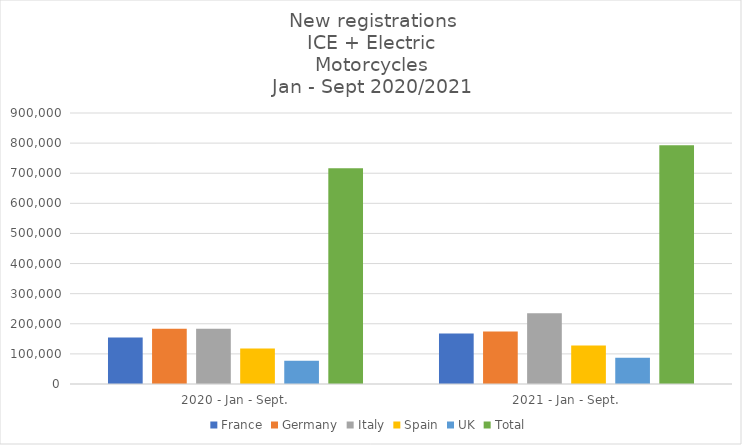
| Category | France | Germany | Italy | Spain | UK | Total |
|---|---|---|---|---|---|---|
| 2020 - Jan - Sept. | 154823 | 183628 | 183777 | 117644 | 76830 | 716702 |
| 2021 - Jan - Sept. | 168008 | 174623 | 235132 | 127872 | 87184 | 792819 |